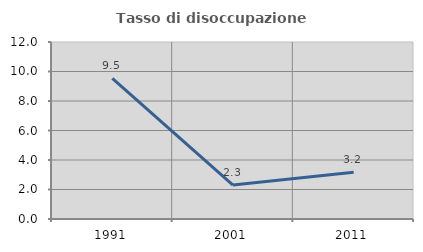
| Category | Tasso di disoccupazione giovanile  |
|---|---|
| 1991.0 | 9.539 |
| 2001.0 | 2.304 |
| 2011.0 | 3.175 |